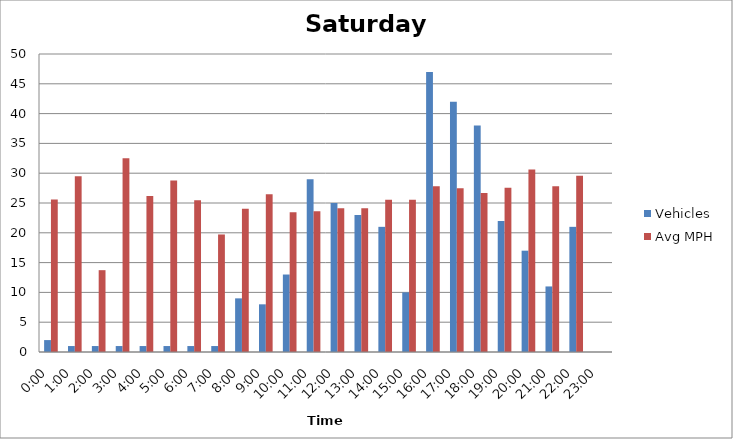
| Category | Vehicles | Avg MPH |
|---|---|---|
| 0:00 | 2 | 25.58 |
| 1:00 | 1 | 29.5 |
| 2:00 | 1 | 13.73 |
| 3:00 | 1 | 32.51 |
| 4:00 | 1 | 26.18 |
| 5:00 | 1 | 28.79 |
| 6:00 | 1 | 25.47 |
| 7:00 | 1 | 19.72 |
| 8:00 | 9 | 24.03 |
| 9:00 | 8 | 26.45 |
| 10:00 | 13 | 23.44 |
| 11:00 | 29 | 23.63 |
| 12:00 | 25 | 24.13 |
| 13:00 | 23 | 24.12 |
| 14:00 | 21 | 25.55 |
| 15:00 | 10 | 25.53 |
| 16:00 | 47 | 27.79 |
| 17:00 | 42 | 27.49 |
| 18:00 | 38 | 26.66 |
| 19:00 | 22 | 27.56 |
| 20:00 | 17 | 30.61 |
| 21:00 | 11 | 27.83 |
| 22:00 | 21 | 29.58 |
| 23:00 | 0 | 0 |